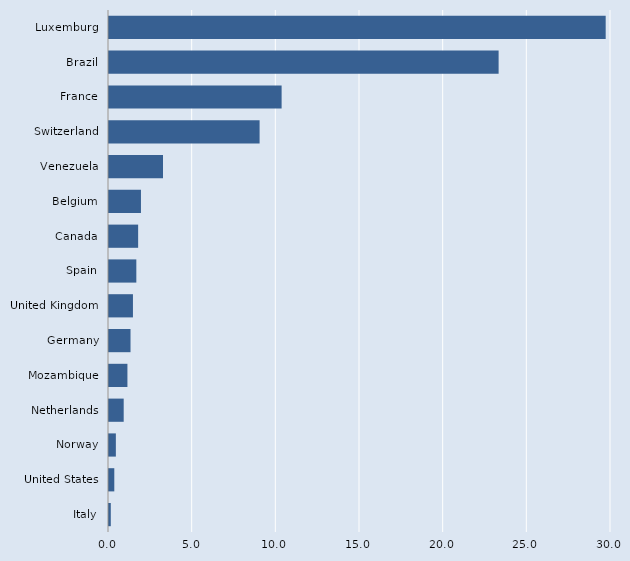
| Category | Series 0 |
|---|---|
| Italy | 0.107 |
| United States | 0.317 |
| Norway | 0.41 |
| Netherlands | 0.878 |
| Mozambique | 1.101 |
| Germany | 1.286 |
| United Kingdom | 1.431 |
| Spain | 1.633 |
| Canada | 1.742 |
| Belgium | 1.91 |
| Venezuela | 3.227 |
| Switzerland | 9 |
| France | 10.316 |
| Brazil | 23.284 |
| Luxemburg | 29.682 |